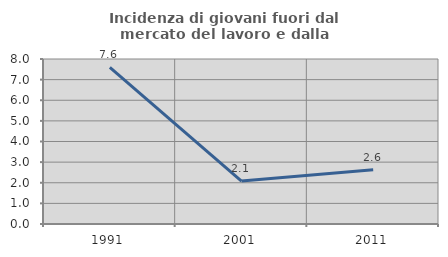
| Category | Incidenza di giovani fuori dal mercato del lavoro e dalla formazione  |
|---|---|
| 1991.0 | 7.595 |
| 2001.0 | 2.083 |
| 2011.0 | 2.632 |